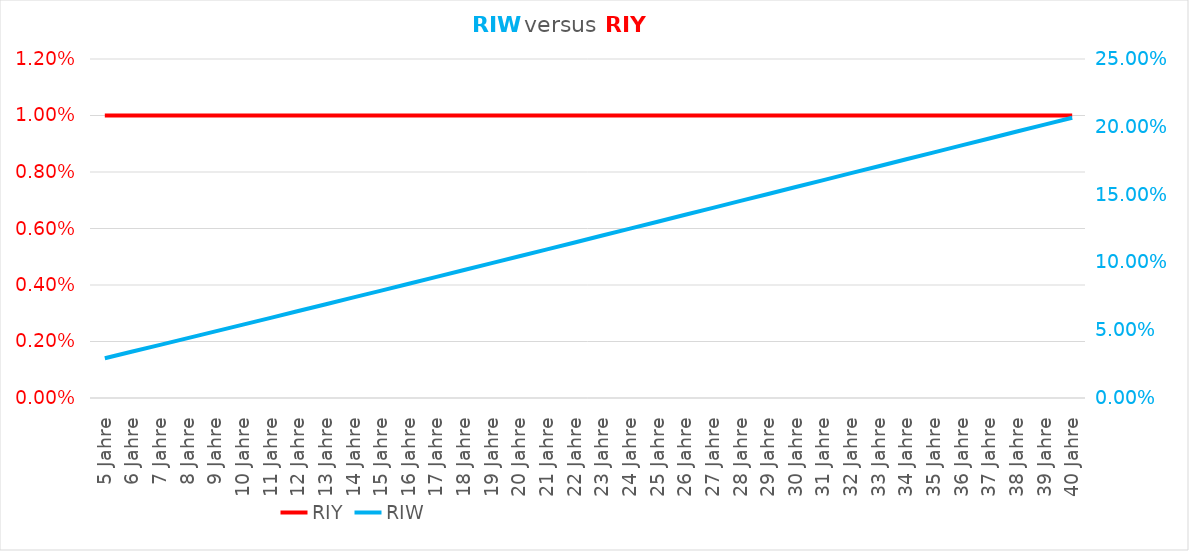
| Category | RIY |
|---|---|
| 5 Jahre | 0.01 |
| 6 Jahre | 0.01 |
| 7 Jahre | 0.01 |
| 8 Jahre | 0.01 |
| 9 Jahre | 0.01 |
| 10 Jahre | 0.01 |
| 11 Jahre | 0.01 |
| 12 Jahre | 0.01 |
| 13 Jahre | 0.01 |
| 14 Jahre | 0.01 |
| 15 Jahre | 0.01 |
| 16 Jahre | 0.01 |
| 17 Jahre | 0.01 |
| 18 Jahre | 0.01 |
| 19 Jahre | 0.01 |
| 20 Jahre | 0.01 |
| 21 Jahre | 0.01 |
| 22 Jahre | 0.01 |
| 23 Jahre | 0.01 |
| 24 Jahre | 0.01 |
| 25 Jahre | 0.01 |
| 26 Jahre | 0.01 |
| 27 Jahre | 0.01 |
| 28 Jahre | 0.01 |
| 29 Jahre | 0.01 |
| 30 Jahre | 0.01 |
| 31 Jahre | 0.01 |
| 32 Jahre | 0.01 |
| 33 Jahre | 0.01 |
| 34 Jahre | 0.01 |
| 35 Jahre | 0.01 |
| 36 Jahre | 0.01 |
| 37 Jahre | 0.01 |
| 38 Jahre | 0.01 |
| 39 Jahre | 0.01 |
| 40 Jahre | 0.01 |